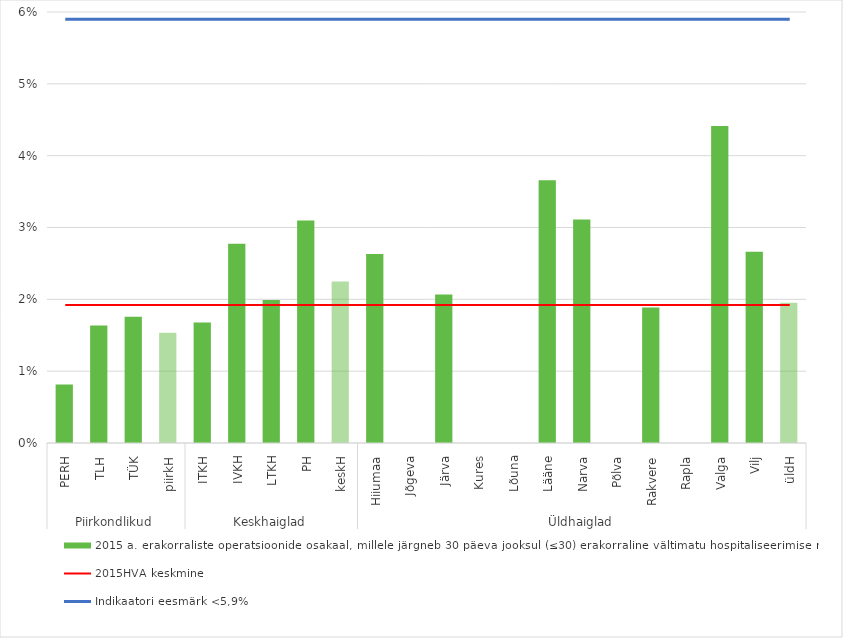
| Category | 2015 a. erakorraliste operatsioonide osakaal, millele järgneb 30 päeva jooksul (≤30) erakorraline vältimatu hospitaliseerimise raviarve |
|---|---|
| 0 | 0.008 |
| 1 | 0.016 |
| 2 | 0.018 |
| 3 | 0.015 |
| 4 | 0.017 |
| 5 | 0.028 |
| 6 | 0.02 |
| 7 | 0.031 |
| 8 | 0.022 |
| 9 | 0.026 |
| 10 | 0 |
| 11 | 0.021 |
| 12 | 0 |
| 13 | 0 |
| 14 | 0.037 |
| 15 | 0.031 |
| 16 | 0 |
| 17 | 0.019 |
| 18 | 0 |
| 19 | 0.044 |
| 20 | 0.027 |
| 21 | 0.02 |